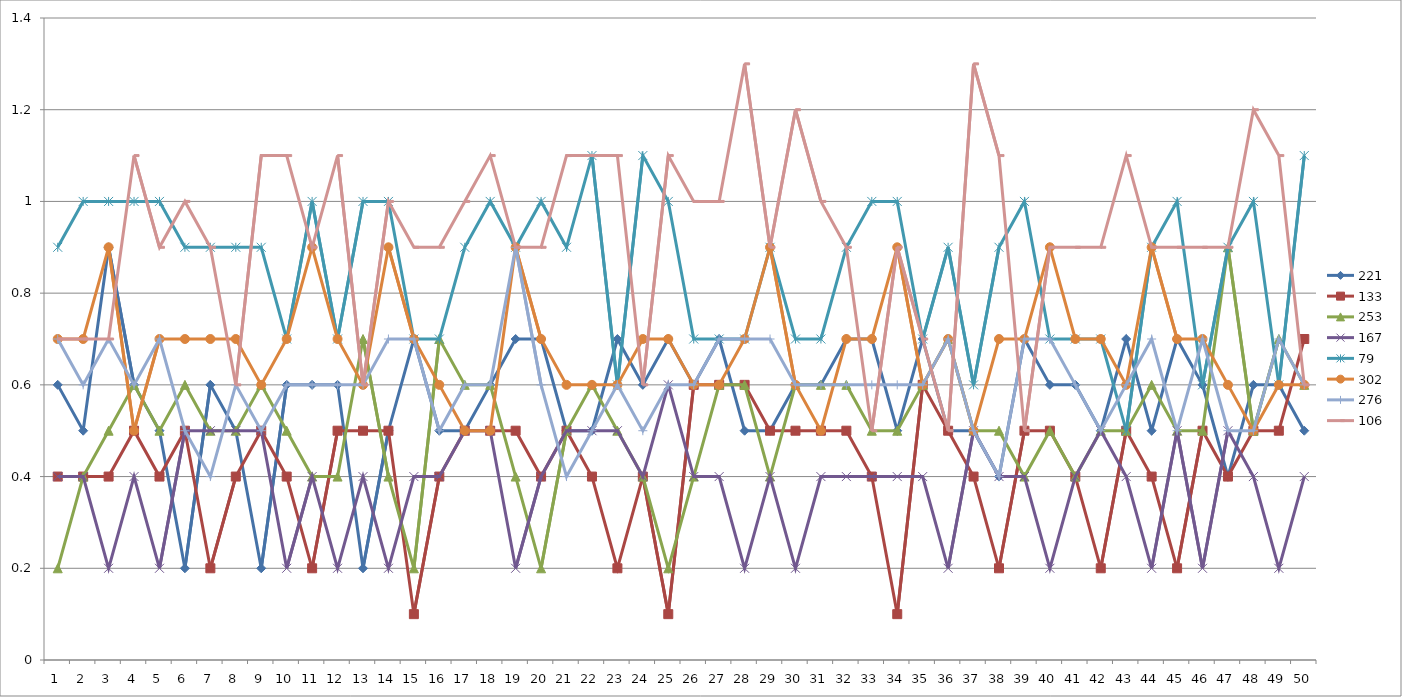
| Category | 221 | 133 | 253 | 167 | 79 | 302 | 276 | 106 |
|---|---|---|---|---|---|---|---|---|
| 0 | 0.6 | 0.4 | 0.2 | 0.4 | 0.9 | 0.7 | 0.7 | 0.7 |
| 1 | 0.5 | 0.4 | 0.4 | 0.4 | 1 | 0.7 | 0.6 | 0.7 |
| 2 | 0.9 | 0.4 | 0.5 | 0.2 | 1 | 0.9 | 0.7 | 0.7 |
| 3 | 0.6 | 0.5 | 0.6 | 0.4 | 1 | 0.5 | 0.6 | 1.1 |
| 4 | 0.5 | 0.4 | 0.5 | 0.2 | 1 | 0.7 | 0.7 | 0.9 |
| 5 | 0.2 | 0.5 | 0.6 | 0.5 | 0.9 | 0.7 | 0.5 | 1 |
| 6 | 0.6 | 0.2 | 0.5 | 0.5 | 0.9 | 0.7 | 0.4 | 0.9 |
| 7 | 0.5 | 0.4 | 0.5 | 0.5 | 0.9 | 0.7 | 0.6 | 0.6 |
| 8 | 0.2 | 0.5 | 0.6 | 0.5 | 0.9 | 0.6 | 0.5 | 1.1 |
| 9 | 0.6 | 0.4 | 0.5 | 0.2 | 0.7 | 0.7 | 0.6 | 1.1 |
| 10 | 0.6 | 0.2 | 0.4 | 0.4 | 1 | 0.9 | 0.6 | 0.9 |
| 11 | 0.6 | 0.5 | 0.4 | 0.2 | 0.7 | 0.7 | 0.6 | 1.1 |
| 12 | 0.2 | 0.5 | 0.7 | 0.4 | 1 | 0.6 | 0.6 | 0.6 |
| 13 | 0.5 | 0.5 | 0.4 | 0.2 | 1 | 0.9 | 0.7 | 1 |
| 14 | 0.7 | 0.1 | 0.2 | 0.4 | 0.7 | 0.7 | 0.7 | 0.9 |
| 15 | 0.5 | 0.4 | 0.7 | 0.4 | 0.7 | 0.6 | 0.5 | 0.9 |
| 16 | 0.5 | 0.5 | 0.6 | 0.5 | 0.9 | 0.5 | 0.6 | 1 |
| 17 | 0.6 | 0.5 | 0.6 | 0.5 | 1 | 0.5 | 0.6 | 1.1 |
| 18 | 0.7 | 0.5 | 0.4 | 0.2 | 0.9 | 0.9 | 0.9 | 0.9 |
| 19 | 0.7 | 0.4 | 0.2 | 0.4 | 1 | 0.7 | 0.6 | 0.9 |
| 20 | 0.5 | 0.5 | 0.5 | 0.5 | 0.9 | 0.6 | 0.4 | 1.1 |
| 21 | 0.5 | 0.4 | 0.6 | 0.5 | 1.1 | 0.6 | 0.5 | 1.1 |
| 22 | 0.7 | 0.2 | 0.5 | 0.5 | 0.6 | 0.6 | 0.6 | 1.1 |
| 23 | 0.6 | 0.4 | 0.4 | 0.4 | 1.1 | 0.7 | 0.5 | 0.6 |
| 24 | 0.7 | 0.1 | 0.2 | 0.6 | 1 | 0.7 | 0.6 | 1.1 |
| 25 | 0.6 | 0.6 | 0.4 | 0.4 | 0.7 | 0.6 | 0.6 | 1 |
| 26 | 0.7 | 0.6 | 0.6 | 0.4 | 0.7 | 0.6 | 0.7 | 1 |
| 27 | 0.5 | 0.6 | 0.6 | 0.2 | 0.7 | 0.7 | 0.7 | 1.3 |
| 28 | 0.5 | 0.5 | 0.4 | 0.4 | 0.9 | 0.9 | 0.7 | 0.9 |
| 29 | 0.6 | 0.5 | 0.6 | 0.2 | 0.7 | 0.6 | 0.6 | 1.2 |
| 30 | 0.6 | 0.5 | 0.6 | 0.4 | 0.7 | 0.5 | 0.6 | 1 |
| 31 | 0.7 | 0.5 | 0.6 | 0.4 | 0.9 | 0.7 | 0.6 | 0.9 |
| 32 | 0.7 | 0.4 | 0.5 | 0.4 | 1 | 0.7 | 0.6 | 0.5 |
| 33 | 0.5 | 0.1 | 0.5 | 0.4 | 1 | 0.9 | 0.6 | 0.9 |
| 34 | 0.7 | 0.6 | 0.6 | 0.4 | 0.7 | 0.6 | 0.6 | 0.7 |
| 35 | 0.5 | 0.5 | 0.7 | 0.2 | 0.9 | 0.7 | 0.7 | 0.5 |
| 36 | 0.5 | 0.4 | 0.5 | 0.5 | 0.6 | 0.5 | 0.5 | 1.3 |
| 37 | 0.4 | 0.2 | 0.5 | 0.4 | 0.9 | 0.7 | 0.4 | 1.1 |
| 38 | 0.7 | 0.5 | 0.4 | 0.4 | 1 | 0.7 | 0.7 | 0.5 |
| 39 | 0.6 | 0.5 | 0.5 | 0.2 | 0.7 | 0.9 | 0.7 | 0.9 |
| 40 | 0.6 | 0.4 | 0.4 | 0.4 | 0.7 | 0.7 | 0.6 | 0.9 |
| 41 | 0.5 | 0.2 | 0.5 | 0.5 | 0.7 | 0.7 | 0.5 | 0.9 |
| 42 | 0.7 | 0.5 | 0.5 | 0.4 | 0.5 | 0.6 | 0.6 | 1.1 |
| 43 | 0.5 | 0.4 | 0.6 | 0.2 | 0.9 | 0.9 | 0.7 | 0.9 |
| 44 | 0.7 | 0.2 | 0.5 | 0.5 | 1 | 0.7 | 0.5 | 0.9 |
| 45 | 0.6 | 0.5 | 0.5 | 0.2 | 0.6 | 0.7 | 0.7 | 0.9 |
| 46 | 0.4 | 0.4 | 0.9 | 0.5 | 0.9 | 0.6 | 0.5 | 0.9 |
| 47 | 0.6 | 0.5 | 0.5 | 0.4 | 1 | 0.5 | 0.5 | 1.2 |
| 48 | 0.6 | 0.5 | 0.7 | 0.2 | 0.6 | 0.6 | 0.7 | 1.1 |
| 49 | 0.5 | 0.7 | 0.6 | 0.4 | 1.1 | 0.6 | 0.6 | 0.6 |